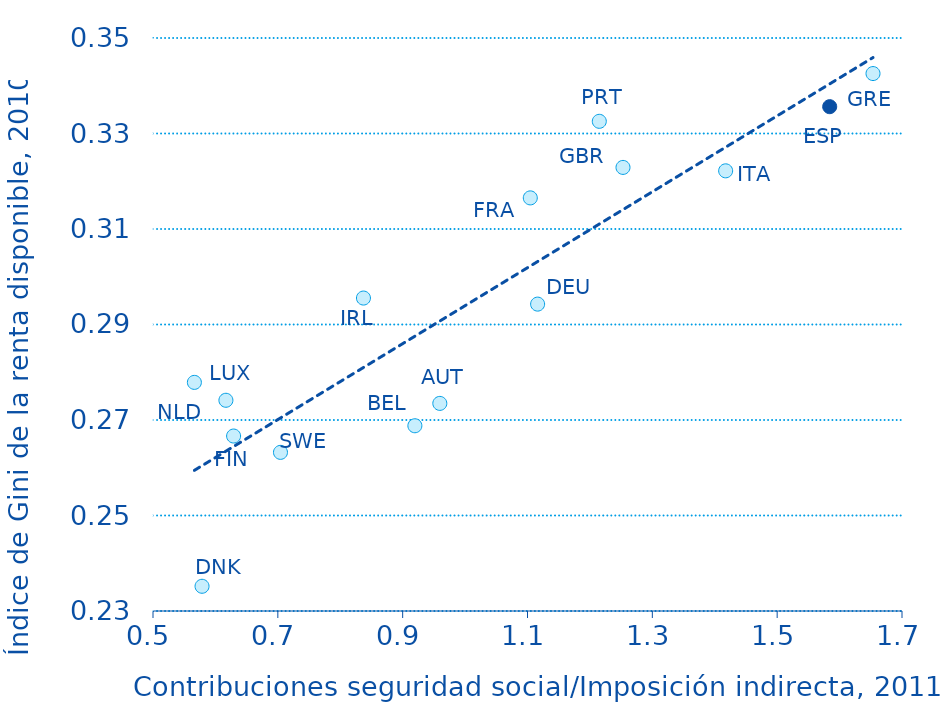
| Category | CA_GDP |
|---|---|
| 0.91955197974215 | 0.269 |
| 0.578576207973273 | 0.235 |
| 1.116199817981393 | 0.294 |
| 0.837193952896519 | 0.296 |
| 1.653555551865344 | 0.343 |
| 1.584159355519341 | 0.336 |
| 1.10448045281851 | 0.317 |
| 1.417465534924518 | 0.322 |
| 0.616805978274616 | 0.274 |
| 0.566311426759093 | 0.278 |
| 0.959525457933592 | 0.273 |
| 1.215031594169676 | 0.333 |
| 0.629139163289688 | 0.267 |
| 0.704235426042578 | 0.263 |
| 1.252997245893538 | 0.323 |